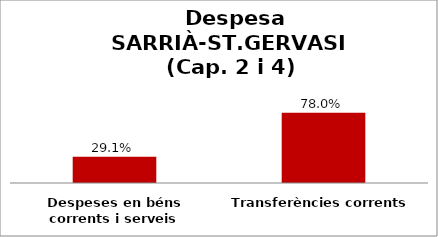
| Category | Series 0 |
|---|---|
| Despeses en béns corrents i serveis | 0.291 |
| Transferències corrents | 0.78 |